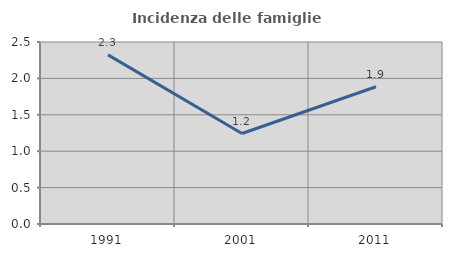
| Category | Incidenza delle famiglie numerose |
|---|---|
| 1991.0 | 2.323 |
| 2001.0 | 1.243 |
| 2011.0 | 1.886 |